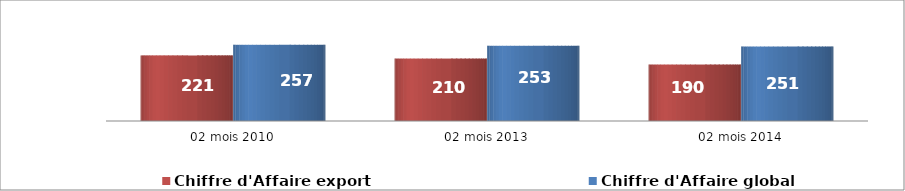
| Category | Chiffre d'Affaire export   | Chiffre d'Affaire global |
|---|---|---|
| 02 mois 2010 | 221.164 | 256.828 |
| 02 mois 2013 | 210.48 | 253.485 |
| 02 mois 2014 | 190.332 | 250.999 |